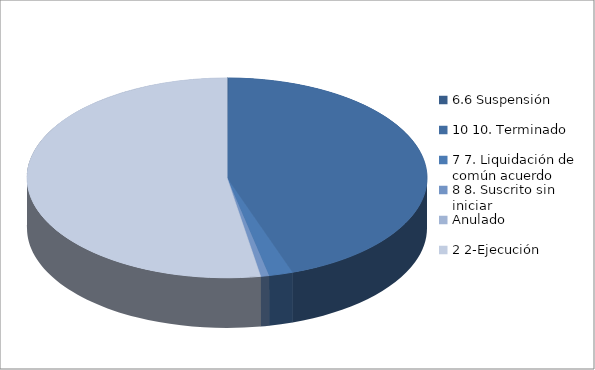
| Category | Series 0 |
|---|---|
| 6.6 Suspensión | 1 |
| 10 10. Terminado | 390 |
| 7 7. Liquidación de común acuerdo | 17 |
| 8 8. Suscrito sin iniciar | 6 |
| Anulado | 0 |
| 2 2-Ejecución | 461 |